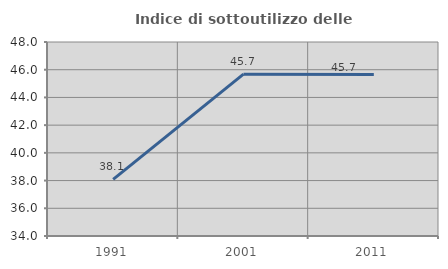
| Category | Indice di sottoutilizzo delle abitazioni  |
|---|---|
| 1991.0 | 38.09 |
| 2001.0 | 45.678 |
| 2011.0 | 45.66 |